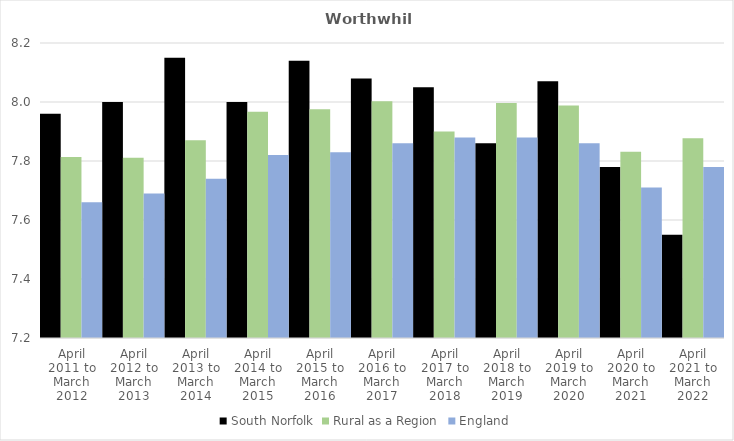
| Category | South Norfolk | Rural as a Region | England |
|---|---|---|---|
| April 2011 to March 2012 | 7.96 | 7.813 | 7.66 |
| April 2012 to March 2013 | 8 | 7.811 | 7.69 |
| April 2013 to March 2014 | 8.15 | 7.871 | 7.74 |
| April 2014 to March 2015 | 8 | 7.967 | 7.82 |
| April 2015 to March 2016 | 8.14 | 7.975 | 7.83 |
| April 2016 to March 2017 | 8.08 | 8.002 | 7.86 |
| April 2017 to March 2018 | 8.05 | 7.9 | 7.88 |
| April 2018 to March 2019 | 7.86 | 7.996 | 7.88 |
| April 2019 to March 2020 | 8.07 | 7.988 | 7.86 |
| April 2020 to March 2021 | 7.78 | 7.831 | 7.71 |
| April 2021 to March 2022 | 7.55 | 7.877 | 7.78 |